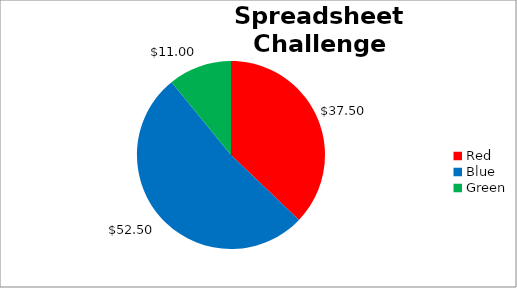
| Category | Subtotal |
|---|---|
| Red | 37.5 |
| Blue | 52.5 |
| Green | 11 |